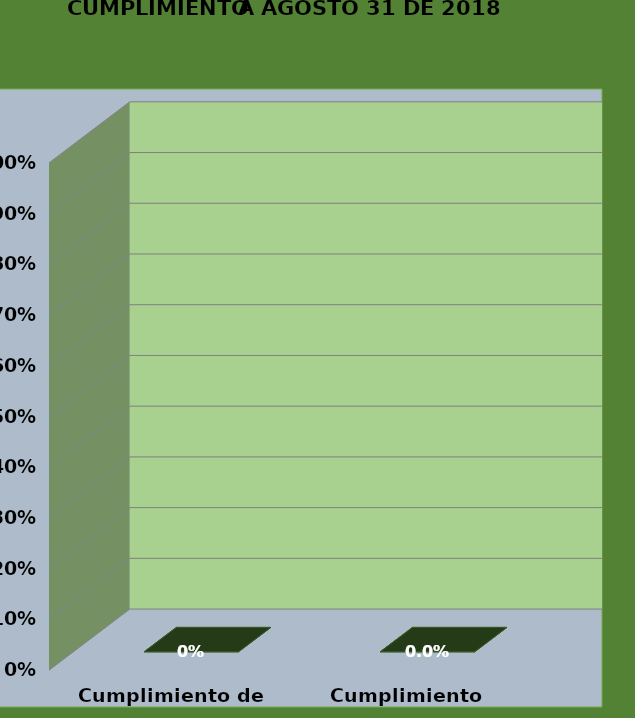
| Category | 31-ago.-18 |
|---|---|
| Cumplimiento de Hitos | 0 |
| Cumplimiento Temporal | 0 |